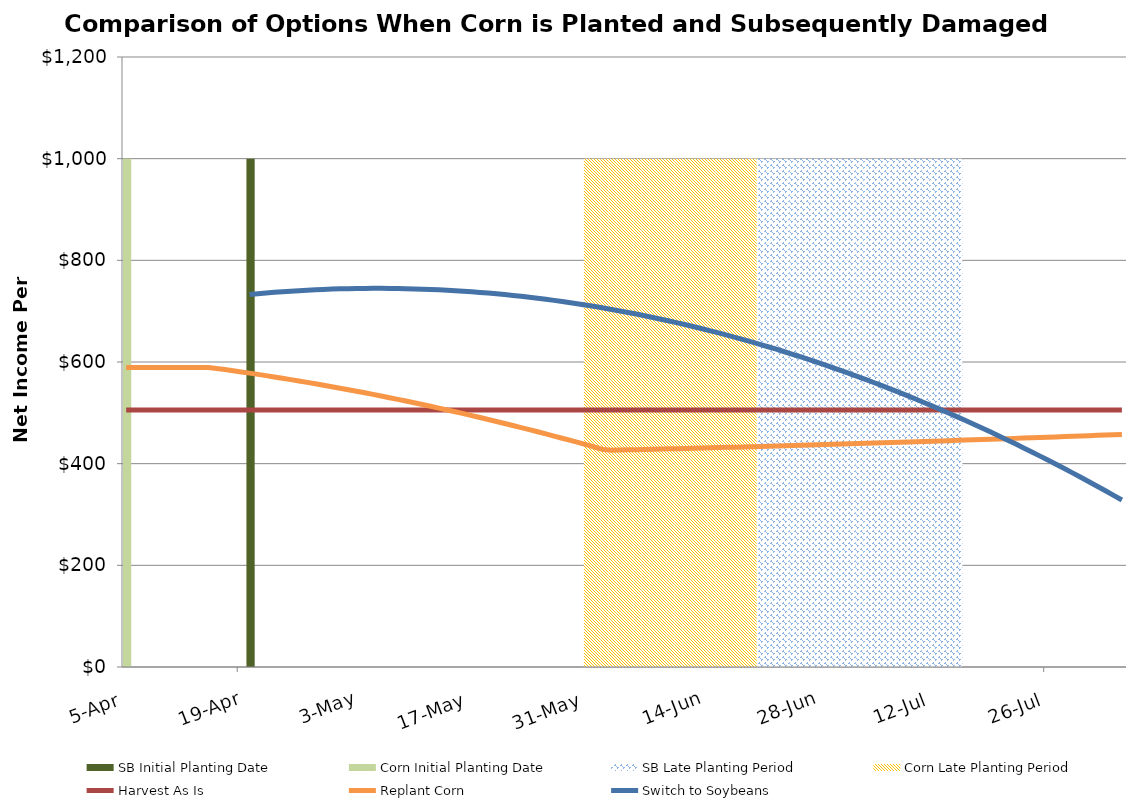
| Category | SB Initial Planting Date | Corn Initial Planting Date | SB Late Planting Period | Corn Late Planting Period |
|---|---|---|---|---|
| 2019-04-05 | 0 | 1000 | 0 | 0 |
| 2019-04-06 | 0 | 0 | 0 | 0 |
| 2019-04-07 | 0 | 0 | 0 | 0 |
| 2019-04-08 | 0 | 0 | 0 | 0 |
| 2019-04-09 | 0 | 0 | 0 | 0 |
| 2019-04-10 | 0 | 0 | 0 | 0 |
| 2019-04-11 | 0 | 0 | 0 | 0 |
| 2019-04-12 | 0 | 0 | 0 | 0 |
| 2019-04-13 | 0 | 0 | 0 | 0 |
| 2019-04-14 | 0 | 0 | 0 | 0 |
| 2019-04-15 | 0 | 0 | 0 | 0 |
| 2019-04-16 | 0 | 0 | 0 | 0 |
| 2019-04-17 | 0 | 0 | 0 | 0 |
| 2019-04-18 | 0 | 0 | 0 | 0 |
| 2019-04-19 | 0 | 0 | 0 | 0 |
| 2019-04-20 | 1000 | 0 | 0 | 0 |
| 2019-04-21 | 0 | 0 | 0 | 0 |
| 2019-04-22 | 0 | 0 | 0 | 0 |
| 2019-04-23 | 0 | 0 | 0 | 0 |
| 2019-04-24 | 0 | 0 | 0 | 0 |
| 2019-04-25 | 0 | 0 | 0 | 0 |
| 2019-04-26 | 0 | 0 | 0 | 0 |
| 2019-04-27 | 0 | 0 | 0 | 0 |
| 2019-04-28 | 0 | 0 | 0 | 0 |
| 2019-04-29 | 0 | 0 | 0 | 0 |
| 2019-04-30 | 0 | 0 | 0 | 0 |
| 2019-05-01 | 0 | 0 | 0 | 0 |
| 2019-05-02 | 0 | 0 | 0 | 0 |
| 2019-05-03 | 0 | 0 | 0 | 0 |
| 2019-05-04 | 0 | 0 | 0 | 0 |
| 2019-05-05 | 0 | 0 | 0 | 0 |
| 2019-05-06 | 0 | 0 | 0 | 0 |
| 2019-05-07 | 0 | 0 | 0 | 0 |
| 2019-05-08 | 0 | 0 | 0 | 0 |
| 2019-05-09 | 0 | 0 | 0 | 0 |
| 2019-05-10 | 0 | 0 | 0 | 0 |
| 2019-05-11 | 0 | 0 | 0 | 0 |
| 2019-05-12 | 0 | 0 | 0 | 0 |
| 2019-05-13 | 0 | 0 | 0 | 0 |
| 2019-05-14 | 0 | 0 | 0 | 0 |
| 2019-05-15 | 0 | 0 | 0 | 0 |
| 2019-05-16 | 0 | 0 | 0 | 0 |
| 2019-05-17 | 0 | 0 | 0 | 0 |
| 2019-05-18 | 0 | 0 | 0 | 0 |
| 2019-05-19 | 0 | 0 | 0 | 0 |
| 2019-05-20 | 0 | 0 | 0 | 0 |
| 2019-05-21 | 0 | 0 | 0 | 0 |
| 2019-05-22 | 0 | 0 | 0 | 0 |
| 2019-05-23 | 0 | 0 | 0 | 0 |
| 2019-05-24 | 0 | 0 | 0 | 0 |
| 2019-05-25 | 0 | 0 | 0 | 0 |
| 2019-05-26 | 0 | 0 | 0 | 0 |
| 2019-05-27 | 0 | 0 | 0 | 0 |
| 2019-05-28 | 0 | 0 | 0 | 0 |
| 2019-05-29 | 0 | 0 | 0 | 0 |
| 2019-05-30 | 0 | 0 | 0 | 0 |
| 2019-05-31 | 0 | 0 | 0 | 1000 |
| 2019-06-01 | 0 | 0 | 0 | 1000 |
| 2019-06-02 | 0 | 0 | 0 | 1000 |
| 2019-06-03 | 0 | 0 | 0 | 1000 |
| 2019-06-04 | 0 | 0 | 0 | 1000 |
| 2019-06-05 | 0 | 0 | 0 | 1000 |
| 2019-06-06 | 0 | 0 | 0 | 1000 |
| 2019-06-07 | 0 | 0 | 0 | 1000 |
| 2019-06-08 | 0 | 0 | 0 | 1000 |
| 2019-06-09 | 0 | 0 | 0 | 1000 |
| 2019-06-10 | 0 | 0 | 0 | 1000 |
| 2019-06-11 | 0 | 0 | 0 | 1000 |
| 2019-06-12 | 0 | 0 | 0 | 1000 |
| 2019-06-13 | 0 | 0 | 0 | 1000 |
| 2019-06-14 | 0 | 0 | 0 | 1000 |
| 2019-06-15 | 0 | 0 | 0 | 1000 |
| 2019-06-16 | 0 | 0 | 0 | 1000 |
| 2019-06-17 | 0 | 0 | 0 | 1000 |
| 2019-06-18 | 0 | 0 | 0 | 1000 |
| 2019-06-19 | 0 | 0 | 0 | 1000 |
| 2019-06-20 | 0 | 0 | 1000 | 1000 |
| 2019-06-21 | 0 | 0 | 1000 | 0 |
| 2019-06-22 | 0 | 0 | 1000 | 0 |
| 2019-06-23 | 0 | 0 | 1000 | 0 |
| 2019-06-24 | 0 | 0 | 1000 | 0 |
| 2019-06-25 | 0 | 0 | 1000 | 0 |
| 2019-06-26 | 0 | 0 | 1000 | 0 |
| 2019-06-27 | 0 | 0 | 1000 | 0 |
| 2019-06-28 | 0 | 0 | 1000 | 0 |
| 2019-06-29 | 0 | 0 | 1000 | 0 |
| 2019-06-30 | 0 | 0 | 1000 | 0 |
| 2019-07-01 | 0 | 0 | 1000 | 0 |
| 2019-07-02 | 0 | 0 | 1000 | 0 |
| 2019-07-03 | 0 | 0 | 1000 | 0 |
| 2019-07-04 | 0 | 0 | 1000 | 0 |
| 2019-07-05 | 0 | 0 | 1000 | 0 |
| 2019-07-06 | 0 | 0 | 1000 | 0 |
| 2019-07-07 | 0 | 0 | 1000 | 0 |
| 2019-07-08 | 0 | 0 | 1000 | 0 |
| 2019-07-09 | 0 | 0 | 1000 | 0 |
| 2019-07-10 | 0 | 0 | 1000 | 0 |
| 2019-07-11 | 0 | 0 | 1000 | 0 |
| 2019-07-12 | 0 | 0 | 1000 | 0 |
| 2019-07-13 | 0 | 0 | 1000 | 0 |
| 2019-07-14 | 0 | 0 | 1000 | 0 |
| 2019-07-15 | 0 | 0 | 1000 | 0 |
| 2019-07-16 | 0 | 0 | 0 | 0 |
| 2019-07-17 | 0 | 0 | 0 | 0 |
| 2019-07-18 | 0 | 0 | 0 | 0 |
| 2019-07-19 | 0 | 0 | 0 | 0 |
| 2019-07-20 | 0 | 0 | 0 | 0 |
| 2019-07-21 | 0 | 0 | 0 | 0 |
| 2019-07-22 | 0 | 0 | 0 | 0 |
| 2019-07-23 | 0 | 0 | 0 | 0 |
| 2019-07-24 | 0 | 0 | 0 | 0 |
| 2019-07-25 | 0 | 0 | 0 | 0 |
| 2019-07-26 | 0 | 0 | 0 | 0 |
| 2019-07-27 | 0 | 0 | 0 | 0 |
| 2019-07-28 | 0 | 0 | 0 | 0 |
| 2019-07-29 | 0 | 0 | 0 | 0 |
| 2019-07-30 | 0 | 0 | 0 | 0 |
| 2019-07-31 | 0 | 0 | 0 | 0 |
| 2019-08-01 | 0 | 0 | 0 | 0 |
| 2019-08-02 | 0 | 0 | 0 | 0 |
| 2019-08-03 | 0 | 0 | 0 | 0 |
| 2019-08-04 | 0 | 0 | 0 | 0 |